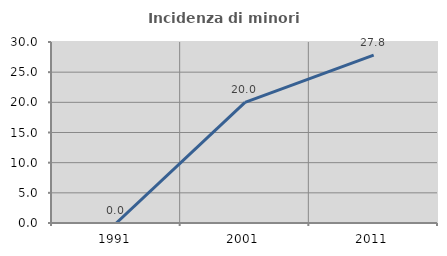
| Category | Incidenza di minori stranieri |
|---|---|
| 1991.0 | 0 |
| 2001.0 | 20 |
| 2011.0 | 27.822 |